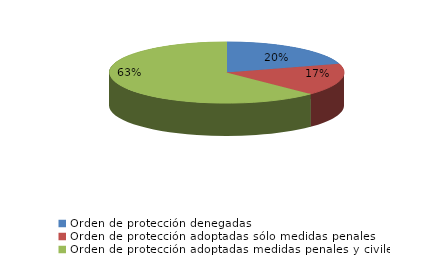
| Category | Series 0 |
|---|---|
| Orden de protección denegadas | 192 |
| Orden de protección adoptadas sólo medidas penales | 160 |
| Orden de protección adoptadas medidas penales y civiles | 591 |